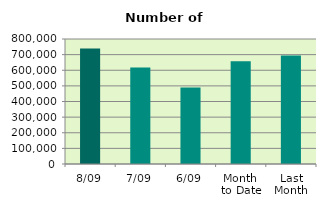
| Category | Series 0 |
|---|---|
| 8/09 | 738558 |
| 7/09 | 617690 |
| 6/09 | 489438 |
| Month 
to Date | 657234 |
| Last
Month | 695004.455 |